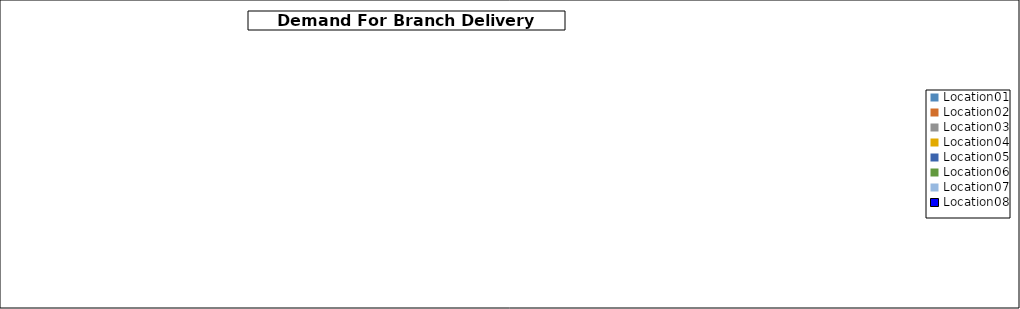
| Category | Data A |
|---|---|
| Location01 | 0 |
| Location02 | 0 |
| Location03 | 0 |
| Location04 | 0 |
| Location05 | 0 |
| Location06 | 0 |
| Location07 | 0 |
| Location08 | 0 |